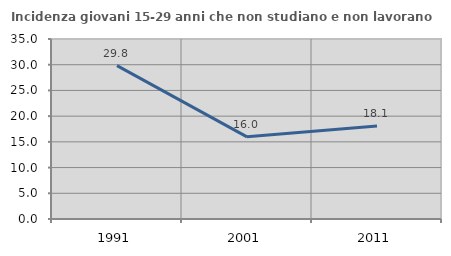
| Category | Incidenza giovani 15-29 anni che non studiano e non lavorano  |
|---|---|
| 1991.0 | 29.825 |
| 2001.0 | 15.972 |
| 2011.0 | 18.065 |